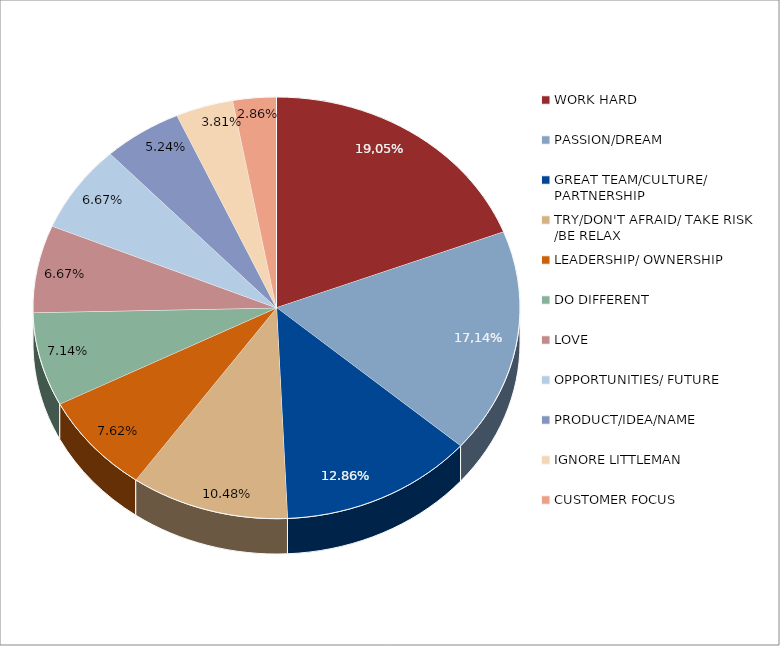
| Category | Series 0 |
|---|---|
| WORK HARD | 0.19 |
| PASSION/DREAM | 0.171 |
| GREAT TEAM/CULTURE/ PARTNERSHIP | 0.129 |
| TRY/DON'T AFRAID/ TAKE RISK
/BE RELAX | 0.105 |
| LEADERSHIP/ OWNERSHIP | 0.076 |
| DO DIFFERENT | 0.071 |
| LOVE | 0.067 |
| OPPORTUNITIES/ FUTURE | 0.067 |
| PRODUCT/IDEA/NAME | 0.052 |
| IGNORE LITTLEMAN | 0.038 |
| CUSTOMER FOCUS | 0.029 |